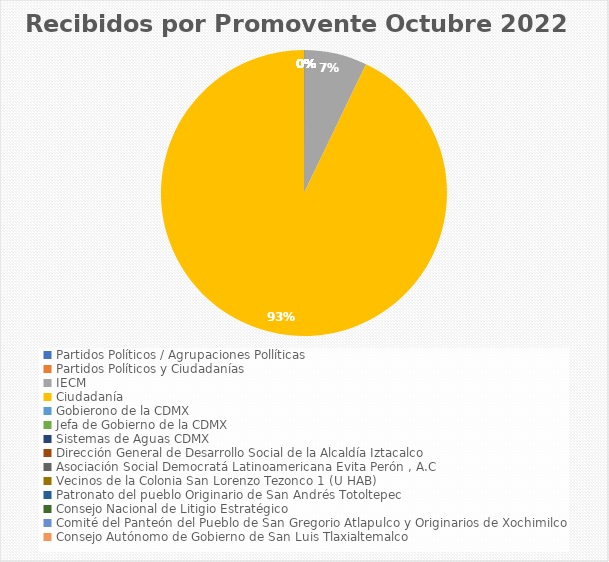
| Category | Recibidos por Promovente Octubre |
|---|---|
| Partidos Políticos / Agrupaciones Pollíticas | 0 |
| Partidos Políticos y Ciudadanías | 0 |
| IECM | 2 |
| Ciudadanía  | 26 |
| Gobierono de la CDMX | 0 |
| Jefa de Gobierno de la CDMX | 0 |
| Sistemas de Aguas CDMX | 0 |
| Dirección General de Desarrollo Social de la Alcaldía Iztacalco | 0 |
| Asociación Social Democratá Latinoamericana Evita Perón , A.C | 0 |
| Vecinos de la Colonia San Lorenzo Tezonco 1 (U HAB) | 0 |
| Patronato del pueblo Originario de San Andrés Totoltepec | 0 |
| Consejo Nacional de Litigio Estratégico | 0 |
| Comité del Panteón del Pueblo de San Gregorio Atlapulco y Originarios de Xochimilco | 0 |
| Consejo Autónomo de Gobierno de San Luis Tlaxialtemalco | 0 |